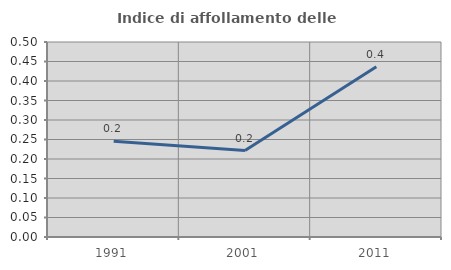
| Category | Indice di affollamento delle abitazioni  |
|---|---|
| 1991.0 | 0.246 |
| 2001.0 | 0.222 |
| 2011.0 | 0.437 |